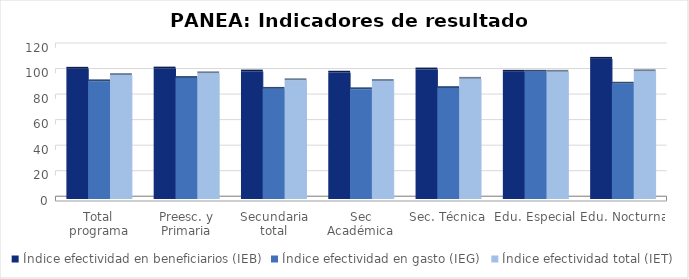
| Category | Índice efectividad en beneficiarios (IEB) | Índice efectividad en gasto (IEG)  | Índice efectividad total (IET) |
|---|---|---|---|
| Total programa | 101.953 | 92.137 | 97.045 |
| Preesc. y Primaria | 102.114 | 94.743 | 98.428 |
| Secundaria total | 99.77 | 86.235 | 93.002 |
| Sec Académica | 98.894 | 85.91 | 92.402 |
| Sec. Técnica | 101.38 | 86.829 | 94.105 |
| Edu. Especial | 99.602 | 99.605 | 99.604 |
| Edu. Nocturna | 109.747 | 90.259 | 100.003 |